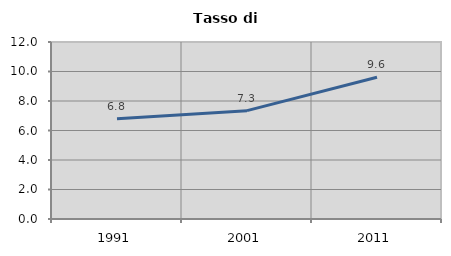
| Category | Tasso di disoccupazione   |
|---|---|
| 1991.0 | 6.796 |
| 2001.0 | 7.347 |
| 2011.0 | 9.609 |